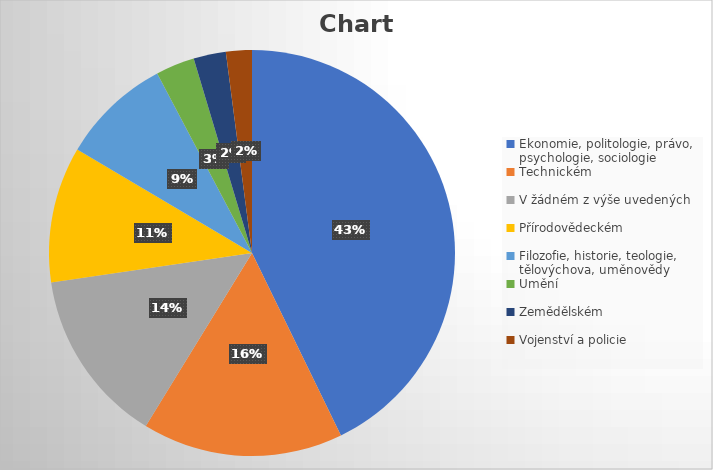
| Category | Series 0 |
|---|---|
| Ekonomie, politologie, právo, psychologie, sociologie | 83 |
| Technickém | 31 |
| V žádném z výše uvedených | 27 |
| Přírodovědeckém | 21 |
| Filozofie, historie, teologie, tělovýchova, uměnovědy | 17 |
| Umění | 6 |
| Zemědělském | 5 |
| Vojenství a policie | 4 |